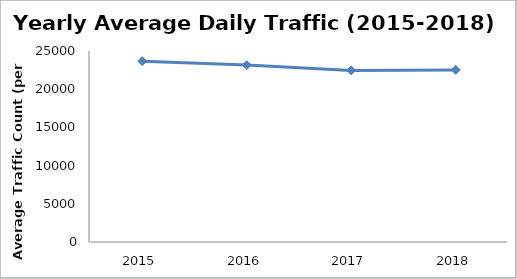
| Category | Series 0 |
|---|---|
| 2015.0 | 23664.082 |
| 2016.0 | 23153.117 |
| 2017.0 | 22458.674 |
| 2018.0 | 22526.83 |